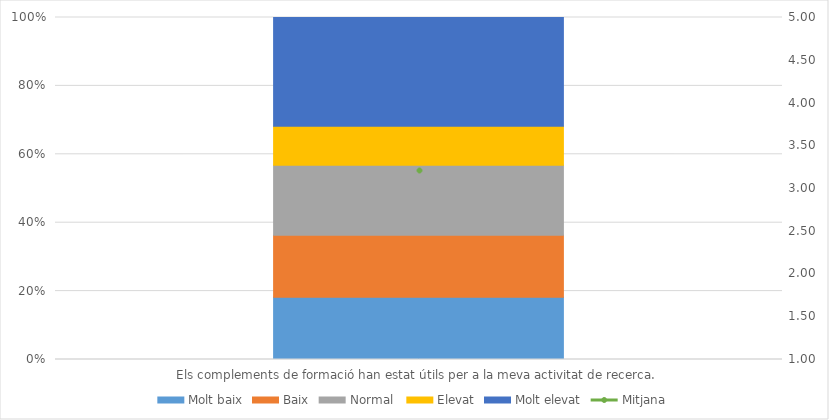
| Category | Molt baix | Baix | Normal  | Elevat | Molt elevat |
|---|---|---|---|---|---|
| Els complements de formació han estat útils per a la meva activitat de recerca. | 8 | 8 | 9 | 5 | 14 |